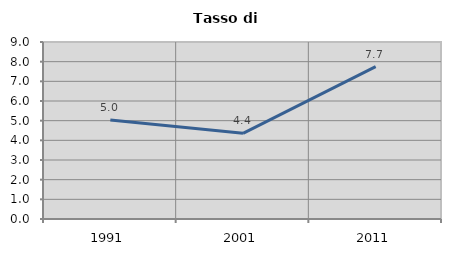
| Category | Tasso di disoccupazione   |
|---|---|
| 1991.0 | 5.032 |
| 2001.0 | 4.358 |
| 2011.0 | 7.748 |